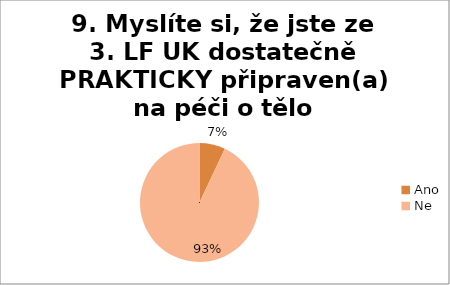
| Category | 9. Myslíte si, že jste ze 3. LF UK dostatečně PRAKTICKY připraven(a) na péči o tělo zemřelého?  |
|---|---|
| Ano | 0.07 |
| Ne | 0.93 |